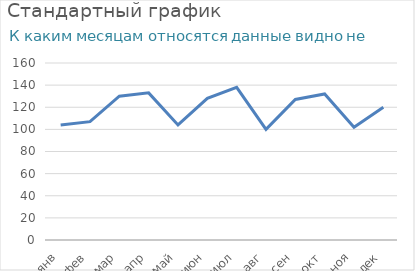
| Category | Выручка |
|---|---|
| янв | 104 |
| фев | 107 |
| мар | 130 |
| апр | 133 |
| май | 104 |
| июн | 128 |
| июл | 138 |
| авг | 100 |
| сен | 127 |
| окт | 132 |
| ноя | 102 |
| дек | 120 |